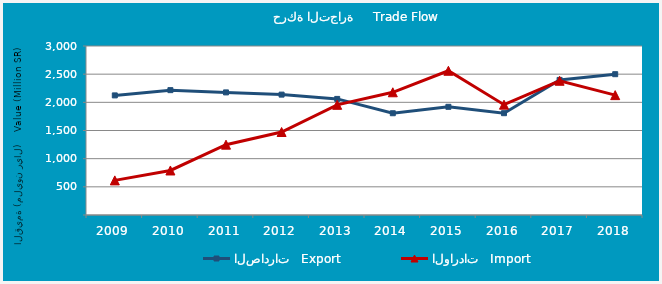
| Category | الصادرات   Export | الواردات   Import |
|---|---|---|
| 2009.0 | 2123155279 | 614598156 |
| 2010.0 | 2216267756 | 790419426 |
| 2011.0 | 2176351386 | 1248508262 |
| 2012.0 | 2137047340 | 1473274613 |
| 2013.0 | 2060599286 | 1955577939 |
| 2014.0 | 1806443293 | 2178448547 |
| 2015.0 | 1920429433 | 2560161115 |
| 2016.0 | 1807162537 | 1958657280 |
| 2017.0 | 2397890252 | 2382999986 |
| 2018.0 | 2499469825 | 2127786983 |